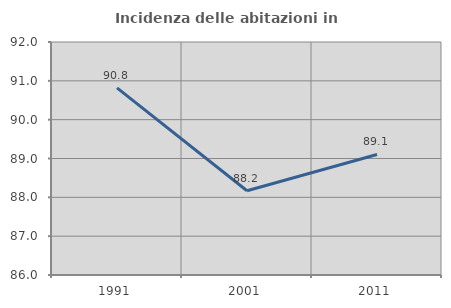
| Category | Incidenza delle abitazioni in proprietà  |
|---|---|
| 1991.0 | 90.82 |
| 2001.0 | 88.169 |
| 2011.0 | 89.104 |